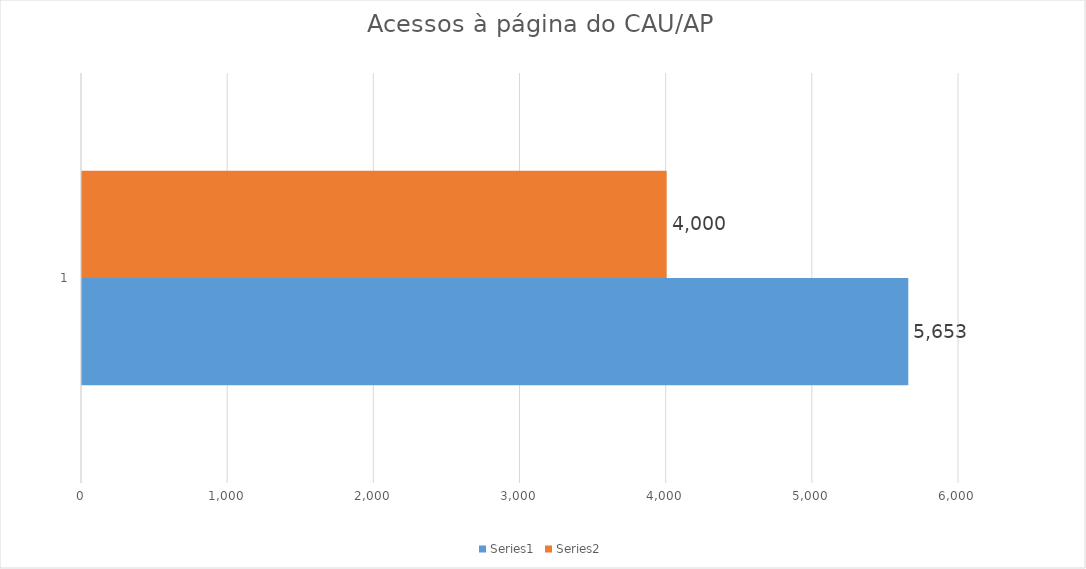
| Category | Series 0 | Series 1 |
|---|---|---|
| 0 | 5653 | 4000 |